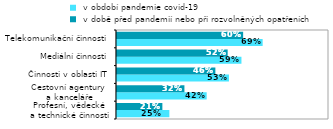
| Category |  v období pandemie covid-19 |  v době před pandemií nebo při rozvolněných opatřeních |
|---|---|---|
| Profesní, vědecké 
a technické činnosti | 0.247 | 0.214 |
| Cestovní agentury 
a kanceláře | 0.423 | 0.318 |
| Činnosti v oblasti IT | 0.528 | 0.464 |
| Mediální činnosti | 0.587 | 0.522 |
| Telekomunikační činnosti | 0.687 | 0.595 |